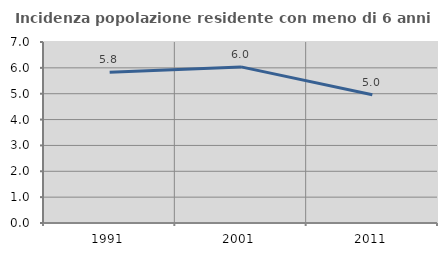
| Category | Incidenza popolazione residente con meno di 6 anni |
|---|---|
| 1991.0 | 5.83 |
| 2001.0 | 6.038 |
| 2011.0 | 4.958 |